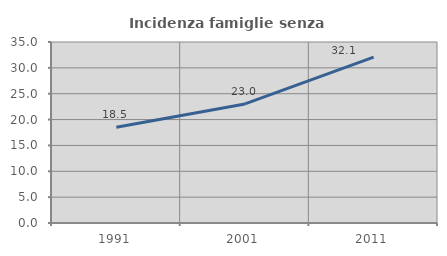
| Category | Incidenza famiglie senza nuclei |
|---|---|
| 1991.0 | 18.528 |
| 2001.0 | 23.027 |
| 2011.0 | 32.084 |